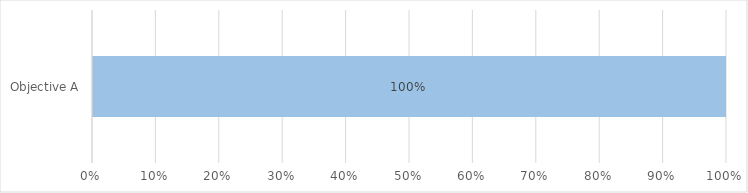
| Category | Not yet assessed | Not Relevant | Not achieved | Partially Achieved | Achieved |
|---|---|---|---|---|---|
| Objective A | 1 | 0 | 0 | 0 | 0 |